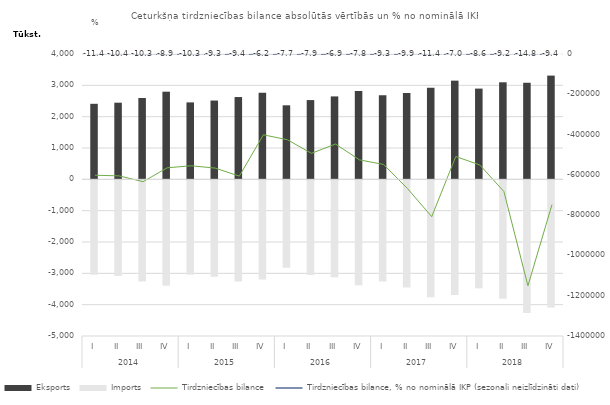
| Category | Eksports | Imports |
|---|---|---|
| 0 | 2410554 | -3012408 |
| 1 | 2445824 | -3050934 |
| 2 | 2595124 | -3228907 |
| 3 | 2797101 | -3362089 |
| 4 | 2455721 | -3010550 |
| 5 | 2514576 | -3081107 |
| 6 | 2625995 | -3232309 |
| 7 | 2766919 | -3168167 |
| 8 | 2362629 | -2788307 |
| 9 | 2529501 | -3022638 |
| 10 | 2646360 | -3093254 |
| 11 | 2819214 | -3345021 |
| 12 | 2681232 | -3229657 |
| 13 | 2753268 | -3422217 |
| 14 | 2922867 | -3730515 |
| 15 | 3149666 | -3658685 |
| 16 | 2895537 | -3446567 |
| 17 | 3097284 | -3779666 |
| 18 | 3082224 | -4232729 |
| 19 | 3310711 | -4058796 |